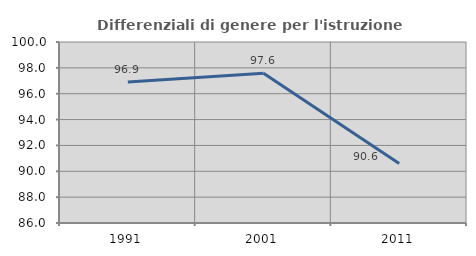
| Category | Differenziali di genere per l'istruzione superiore |
|---|---|
| 1991.0 | 96.906 |
| 2001.0 | 97.573 |
| 2011.0 | 90.596 |